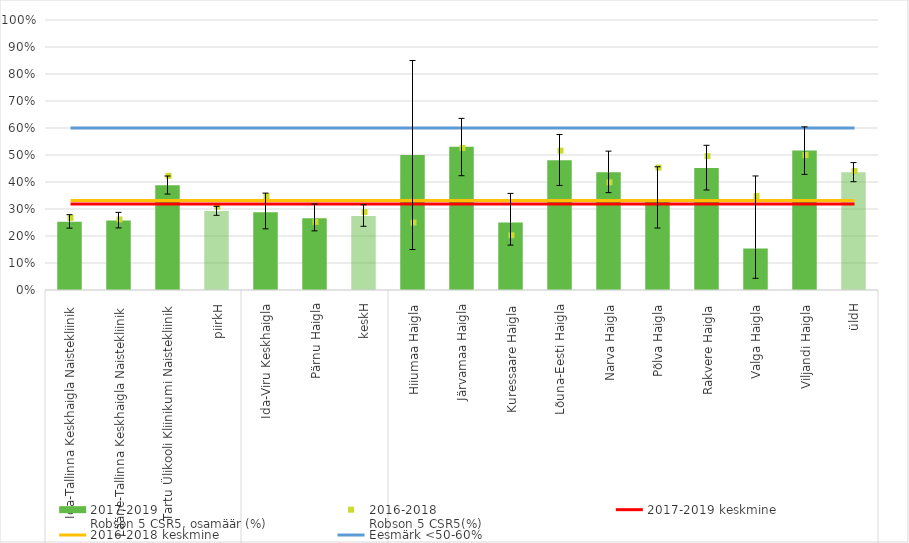
| Category | 2017-2019
Robson 5 CSR5, osamäär (%) |
|---|---|
| 0 | 0.253 |
| 1 | 0.258 |
| 2 | 0.388 |
| 3 | 0.293 |
| 4 | 0.288 |
| 5 | 0.266 |
| 6 | 0.274 |
| 7 | 0.5 |
| 8 | 0.531 |
| 9 | 0.25 |
| 10 | 0.481 |
| 11 | 0.436 |
| 12 | 0.333 |
| 13 | 0.452 |
| 14 | 0.154 |
| 15 | 0.517 |
| 16 | 0.436 |